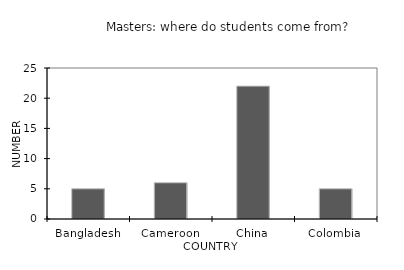
| Category | total |
|---|---|
| Bangladesh | 5 |
| Cameroon | 6 |
| China | 22 |
| Colombia | 5 |